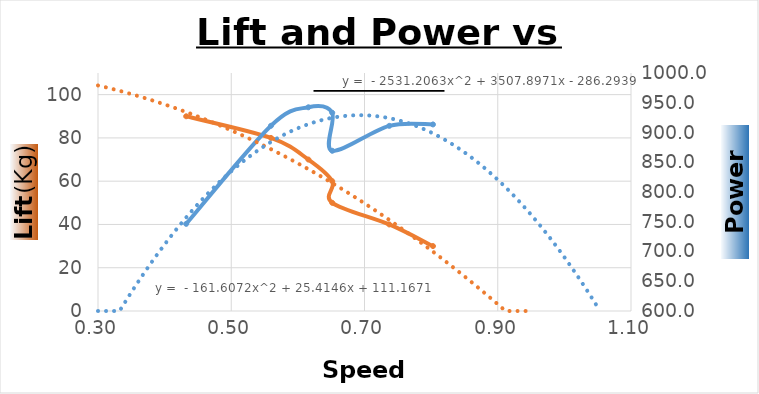
| Category | Series 1 |
|---|---|
| 0.8027923211169286 | 30 |
| 0.7371794871794872 | 40 |
| 0.651558073654391 | 50 |
| 0.651558073654391 | 60 |
| 0.6157965194109772 | 70 |
| 0.5596107055961071 | 80 |
| 0.4323308270676692 | 90 |